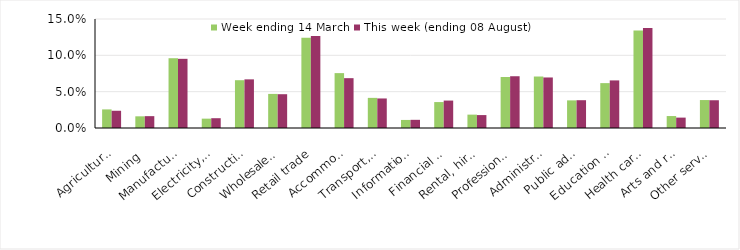
| Category | Week ending 14 March | This week (ending 08 August) |
|---|---|---|
| Agriculture, forestry and fishing | 0.026 | 0.024 |
| Mining | 0.016 | 0.016 |
| Manufacturing | 0.096 | 0.095 |
| Electricity, gas, water and waste services | 0.013 | 0.013 |
| Construction | 0.066 | 0.067 |
| Wholesale trade | 0.047 | 0.046 |
| Retail trade | 0.124 | 0.127 |
| Accommodation and food services | 0.076 | 0.069 |
| Transport, postal and warehousing | 0.041 | 0.041 |
| Information media and telecommunications | 0.011 | 0.011 |
| Financial and insurance services | 0.036 | 0.038 |
| Rental, hiring and real estate services | 0.018 | 0.018 |
| Professional, scientific and technical services | 0.07 | 0.071 |
| Administrative and support services | 0.071 | 0.07 |
| Public administration and safety | 0.038 | 0.038 |
| Education and training | 0.062 | 0.065 |
| Health care and social assistance | 0.134 | 0.138 |
| Arts and recreation services | 0.016 | 0.014 |
| Other services | 0.038 | 0.038 |